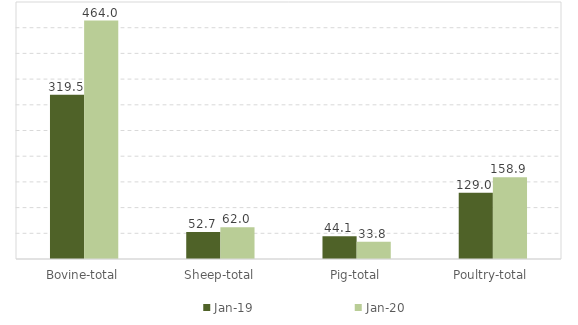
| Category | Jan-19 | Jan-20 |
|---|---|---|
| Bovine-total | 319.5 | 464 |
| Sheep-total | 52.7 | 62 |
| Pig-total | 44.1 | 33.8 |
| Poultry-total | 129 | 158.9 |